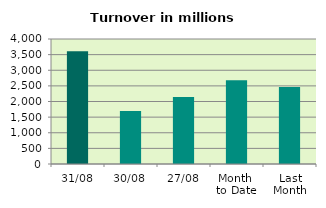
| Category | Series 0 |
|---|---|
| 31/08 | 3604.563 |
| 30/08 | 1695.63 |
| 27/08 | 2146.474 |
| Month 
to Date | 2681.097 |
| Last
Month | 2466.495 |